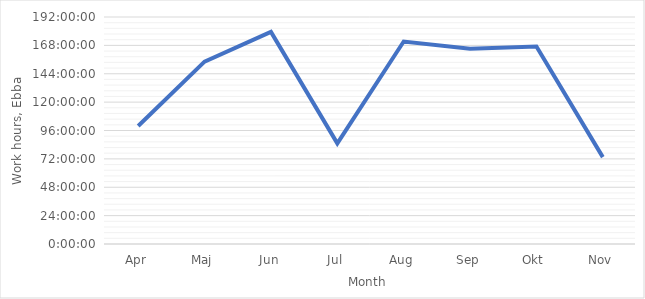
| Category | Series 0 |
|---|---|
| Apr | 1900-01-04 03:49:00 |
| Maj | 1900-01-06 10:18:00 |
| Jun | 1900-01-07 11:25:00 |
| Jul | 1900-01-03 13:08:00 |
| Aug | 1900-01-07 03:15:00 |
| Sep | 1900-01-06 21:15:00 |
| Okt | 1900-01-06 23:03:00 |
| Nov | 1900-01-03 01:29:00 |